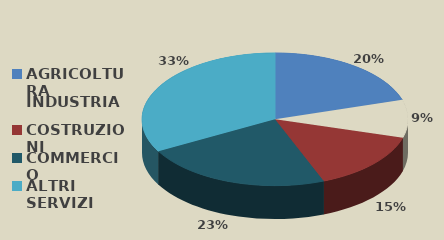
| Category | Series 0 |
|---|---|
| AGRICOLTURA | 7131 |
| INDUSTRIA | 3250 |
| COSTRUZIONI | 5115 |
| COMMERCIO | 8078 |
| ALTRI SERVIZI | 11615 |